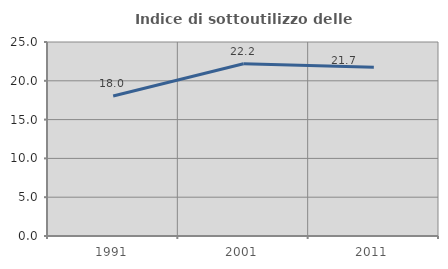
| Category | Indice di sottoutilizzo delle abitazioni  |
|---|---|
| 1991.0 | 18.032 |
| 2001.0 | 22.193 |
| 2011.0 | 21.745 |